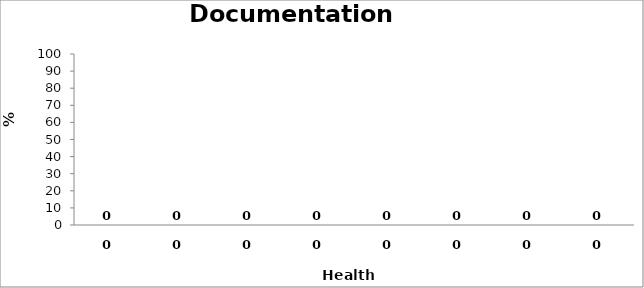
| Category | % Compliance |
|---|---|
| 0.0 | 0 |
| 0.0 | 0 |
| 0.0 | 0 |
| 0.0 | 0 |
| 0.0 | 0 |
| 0.0 | 0 |
| 0.0 | 0 |
| 0.0 | 0 |